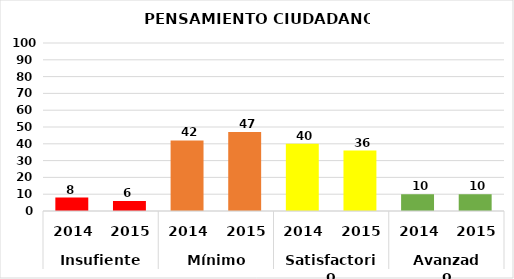
| Category | Series 0 |
|---|---|
| 0 | 8 |
| 1 | 6 |
| 2 | 42 |
| 3 | 47 |
| 4 | 40 |
| 5 | 36 |
| 6 | 10 |
| 7 | 10 |